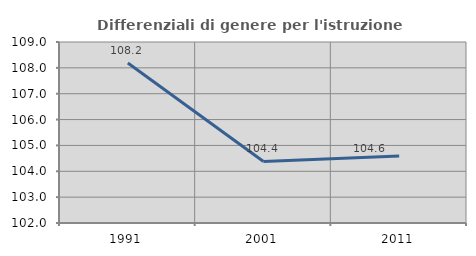
| Category | Differenziali di genere per l'istruzione superiore |
|---|---|
| 1991.0 | 108.186 |
| 2001.0 | 104.379 |
| 2011.0 | 104.593 |